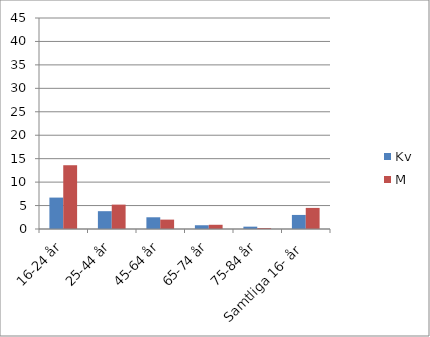
| Category | Kv | M |
|---|---|---|
| 16-24 år | 6.7 | 13.6 |
| 25-44 år | 3.8 | 5.2 |
| 45-64 år | 2.5 | 2 |
| 65-74 år | 0.8 | 0.9 |
| 75-84 år | 0.5 | 0.2 |
| Samtliga 16- år | 3 | 4.5 |